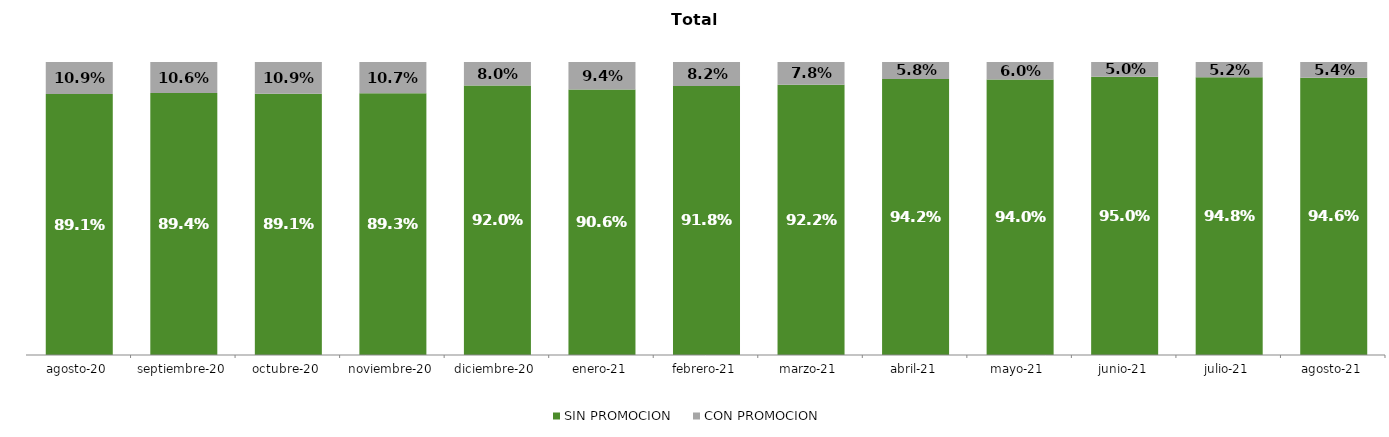
| Category | SIN PROMOCION   | CON PROMOCION   |
|---|---|---|
| 2020-08-01 | 0.891 | 0.109 |
| 2020-09-01 | 0.894 | 0.106 |
| 2020-10-01 | 0.891 | 0.109 |
| 2020-11-01 | 0.893 | 0.107 |
| 2020-12-01 | 0.92 | 0.08 |
| 2021-01-01 | 0.906 | 0.094 |
| 2021-02-01 | 0.918 | 0.082 |
| 2021-03-01 | 0.922 | 0.078 |
| 2021-04-01 | 0.942 | 0.058 |
| 2021-05-01 | 0.94 | 0.06 |
| 2021-06-01 | 0.95 | 0.05 |
| 2021-07-01 | 0.948 | 0.052 |
| 2021-08-01 | 0.946 | 0.054 |